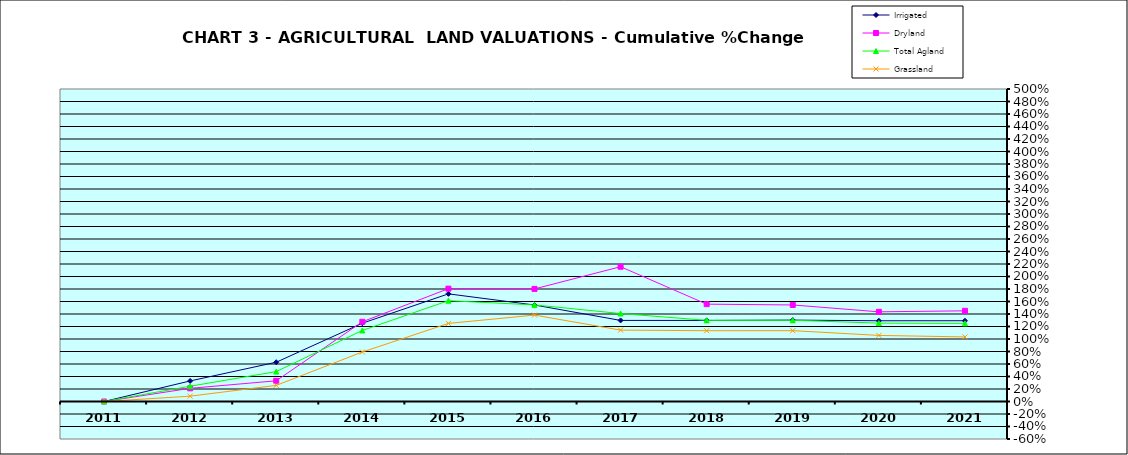
| Category | Irrigated | Dryland | Total Agland | Grassland |
|---|---|---|---|---|
| 2011.0 | 0 | 0 | 0 | 0 |
| 2012.0 | 0.329 | 0.211 | 0.244 | 0.085 |
| 2013.0 | 0.628 | 0.331 | 0.479 | 0.258 |
| 2014.0 | 1.253 | 1.275 | 1.136 | 0.792 |
| 2015.0 | 1.722 | 1.805 | 1.613 | 1.249 |
| 2016.0 | 1.544 | 1.801 | 1.545 | 1.382 |
| 2017.0 | 1.297 | 2.156 | 1.407 | 1.142 |
| 2018.0 | 1.297 | 1.557 | 1.299 | 1.133 |
| 2019.0 | 1.303 | 1.545 | 1.3 | 1.133 |
| 2020.0 | 1.292 | 1.435 | 1.254 | 1.057 |
| 2021.0 | 1.292 | 1.451 | 1.251 | 1.033 |